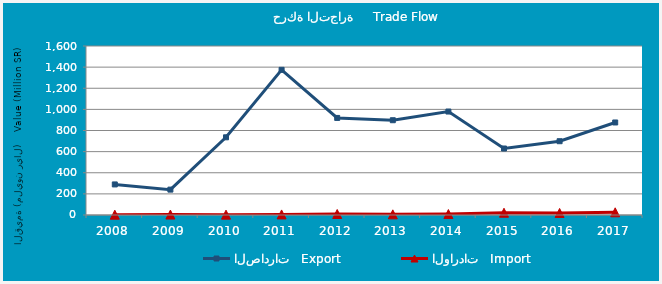
| Category | الصادرات   Export | الواردات   Import |
|---|---|---|
| 2008.0 | 289428355 | 2846212 |
| 2009.0 | 240293699 | 4197109 |
| 2010.0 | 735531187 | 3484302 |
| 2011.0 | 1374276411 | 5350408 |
| 2012.0 | 919034347 | 9414569 |
| 2013.0 | 897228104 | 6308404 |
| 2014.0 | 979516234 | 8935347 |
| 2015.0 | 629584628 | 21552217 |
| 2016.0 | 698585376 | 19303913 |
| 2017.0 | 875983631 | 25580667 |